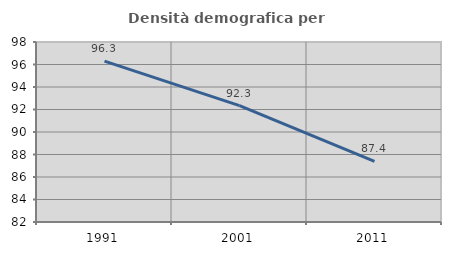
| Category | Densità demografica |
|---|---|
| 1991.0 | 96.301 |
| 2001.0 | 92.345 |
| 2011.0 | 87.386 |